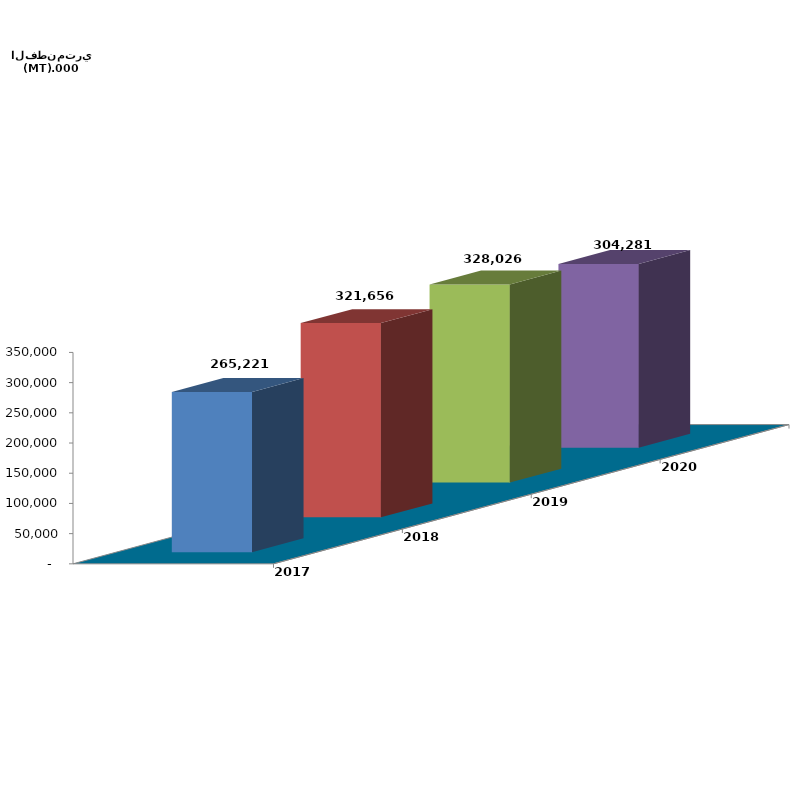
| Category | 2017 | 2018 | 2019 | 2020 |
|---|---|---|---|---|
| 0 | 265220.521 | 321655.847 | 328026.378 | 304280.726 |